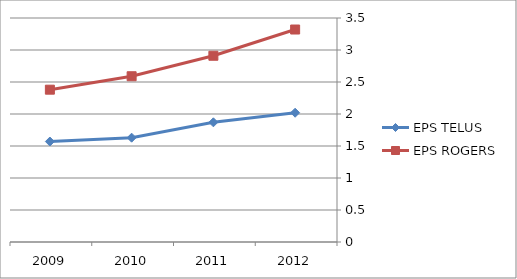
| Category | EPS TELUS | EPS ROGERS |
|---|---|---|
| 2012.0 | 2.02 | 3.32 |
| 2011.0 | 1.87 | 2.91 |
| 2010.0 | 1.63 | 2.59 |
| 2009.0 | 1.57 | 2.38 |